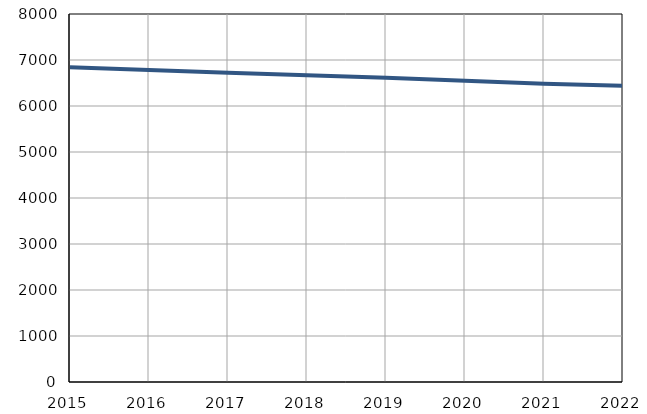
| Category | Број
становника |
|---|---|
| 2015.0 | 6840 |
| 2016.0 | 6783 |
| 2017.0 | 6722 |
| 2018.0 | 6671 |
| 2019.0 | 6612 |
| 2020.0 | 6551 |
| 2021.0 | 6486 |
| 2022.0 | 6438 |